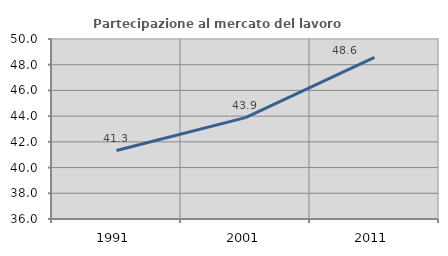
| Category | Partecipazione al mercato del lavoro  femminile |
|---|---|
| 1991.0 | 41.327 |
| 2001.0 | 43.883 |
| 2011.0 | 48.575 |